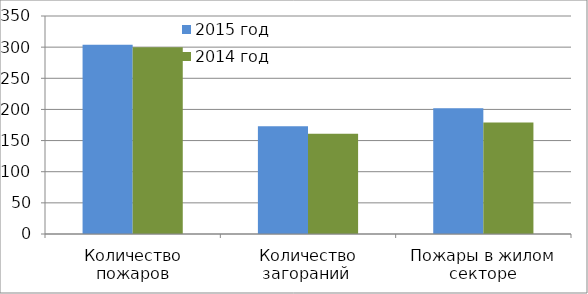
| Category | 2015 год | 2014 год |
|---|---|---|
| Количество пожаров | 304 | 300 |
| Количество загораний  | 173 | 161 |
| Пожары в жилом секторе | 202 | 179 |